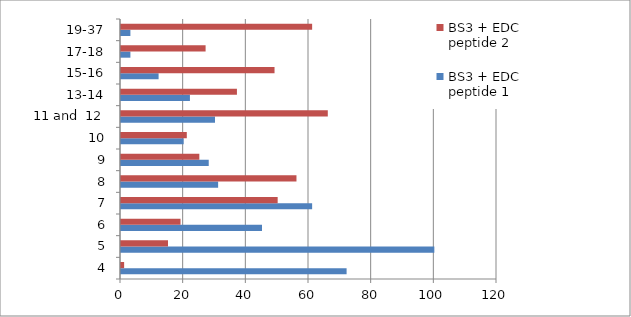
| Category | BS3 + EDC peptide 1 | BS3 + EDC peptide 2  |
|---|---|---|
| 4 | 72 | 1 |
| 5 | 100 | 15 |
| 6 | 45 | 19 |
| 7 | 61 | 50 |
| 8 | 31 | 56 |
| 9 | 28 | 25 |
| 10 | 20 | 21 |
| 11 and  12 | 30 | 66 |
| 13-14 | 22 | 37 |
| 15-16 | 12 | 49 |
| 17-18 | 3 | 27 |
| 19-37 | 3 | 61 |